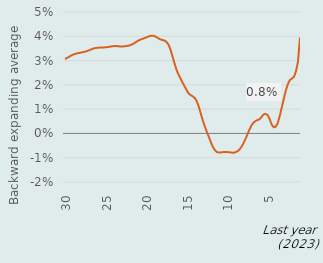
| Category | Series 0 |
|---|---|
| 30 | 0.031 |
|  | 0.031 |
|  | 0.032 |
|  | 0.032 |
| 29 | 0.032 |
|  | 0.033 |
|  | 0.033 |
|  | 0.033 |
| 28 | 0.033 |
|  | 0.033 |
|  | 0.034 |
|  | 0.034 |
| 27 | 0.034 |
|  | 0.035 |
|  | 0.035 |
|  | 0.035 |
| 26 | 0.035 |
|  | 0.035 |
|  | 0.035 |
|  | 0.035 |
| 25 | 0.035 |
|  | 0.036 |
|  | 0.036 |
|  | 0.036 |
| 24 | 0.036 |
|  | 0.036 |
|  | 0.036 |
|  | 0.036 |
| 23 | 0.036 |
|  | 0.036 |
|  | 0.036 |
|  | 0.036 |
| 22 | 0.036 |
|  | 0.037 |
|  | 0.037 |
|  | 0.038 |
| 21 | 0.038 |
|  | 0.039 |
|  | 0.039 |
|  | 0.039 |
| 20 | 0.039 |
|  | 0.04 |
|  | 0.04 |
|  | 0.04 |
| 19 | 0.04 |
|  | 0.04 |
|  | 0.039 |
|  | 0.039 |
| 18 | 0.038 |
|  | 0.038 |
|  | 0.038 |
|  | 0.037 |
| 17 | 0.035 |
|  | 0.032 |
|  | 0.029 |
|  | 0.026 |
| 16 | 0.024 |
|  | 0.023 |
|  | 0.021 |
|  | 0.019 |
| 15 | 0.018 |
|  | 0.016 |
|  | 0.016 |
|  | 0.015 |
| 14 | 0.015 |
|  | 0.013 |
|  | 0.011 |
|  | 0.008 |
| 13 | 0.005 |
|  | 0.003 |
|  | 0.001 |
|  | -0.001 |
| 12 | -0.004 |
|  | -0.006 |
|  | -0.007 |
|  | -0.008 |
| 11 | -0.008 |
|  | -0.008 |
|  | -0.008 |
|  | -0.008 |
| 10 | -0.008 |
|  | -0.008 |
|  | -0.008 |
|  | -0.008 |
| 9 | -0.008 |
|  | -0.007 |
|  | -0.007 |
|  | -0.006 |
| 8 | -0.004 |
|  | -0.003 |
|  | 0 |
|  | 0.001 |
| 7 | 0.003 |
|  | 0.004 |
|  | 0.005 |
|  | 0.006 |
| 6 | 0.006 |
|  | 0.007 |
|  | 0.008 |
|  | 0.008 |
| 5 | 0.008 |
|  | 0.006 |
|  | 0.004 |
|  | 0.003 |
| 4 | 0.003 |
|  | 0.004 |
|  | 0.007 |
|  | 0.011 |
| 3 | 0.014 |
|  | 0.018 |
|  | 0.02 |
|  | 0.022 |
| 2 | 0.023 |
|  | 0.023 |
|  | 0.026 |
|  | 0.029 |
| Last 1 year | 0.039 |